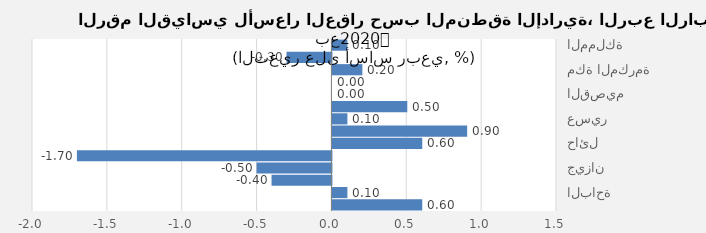
| Category | 2020 |
|---|---|
| المملكة | 0.1 |
| الرياض | -0.3 |
| مكة المكرمة | 0.2 |
| المدينة المنورة | 0 |
| القصيم | 0 |
| المنطقة الشرقية | 0.5 |
| عسير | 0.1 |
| تبوك | 0.9 |
| حائل | 0.6 |
| المنطقة الشمالية | -1.7 |
| جيزان | -0.5 |
| نجران | -0.4 |
| الباحة | 0.1 |
| الجوف | 0.6 |